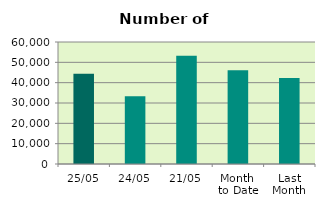
| Category | Series 0 |
|---|---|
| 25/05 | 44350 |
| 24/05 | 33378 |
| 21/05 | 53254 |
| Month 
to Date | 46140.471 |
| Last
Month | 42252.3 |